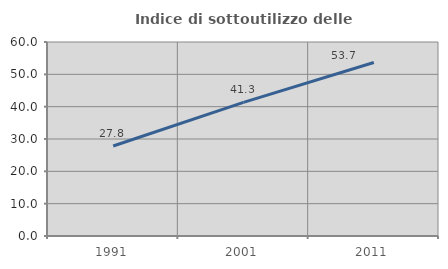
| Category | Indice di sottoutilizzo delle abitazioni  |
|---|---|
| 1991.0 | 27.843 |
| 2001.0 | 41.339 |
| 2011.0 | 53.668 |